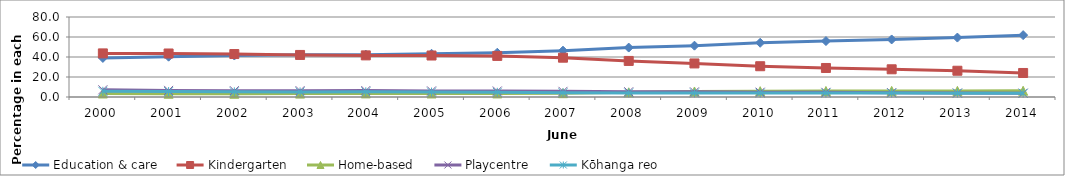
| Category | Education & care | Kindergarten | Home-based | Playcentre | Kōhanga reo |
|---|---|---|---|---|---|
| 2000.0 | 39.074 | 43.603 | 3.519 | 7.216 | 5.7 |
| 2001.0 | 40.319 | 43.513 | 3.25 | 6.619 | 5.414 |
| 2002.0 | 41.476 | 42.958 | 3.222 | 6.344 | 5.157 |
| 2003.0 | 42.236 | 42.047 | 3.394 | 6.348 | 5.078 |
| 2004.0 | 42.367 | 41.612 | 3.6 | 6.427 | 5.163 |
| 2005.0 | 43.234 | 41.47 | 3.501 | 6.113 | 4.934 |
| 2006.0 | 44.257 | 41.09 | 3.555 | 6.008 | 4.703 |
| 2007.0 | 46.33 | 39.31 | 3.827 | 5.66 | 4.237 |
| 2008.0 | 49.429 | 36.073 | 4.706 | 5.258 | 4.054 |
| 2009.0 | 51.313 | 33.55 | 5.513 | 5.151 | 3.978 |
| 2010.0 | 54.228 | 30.768 | 5.814 | 4.822 | 3.878 |
| 2011.0 | 55.924 | 29.019 | 6 | 4.678 | 3.947 |
| 2012.0 | 57.544 | 27.703 | 6.099 | 4.348 | 3.892 |
| 2013.0 | 59.434 | 26.265 | 6.108 | 3.95 | 3.857 |
| 2014.0 | 61.868 | 24.024 | 6.233 | 3.8 | 3.714 |